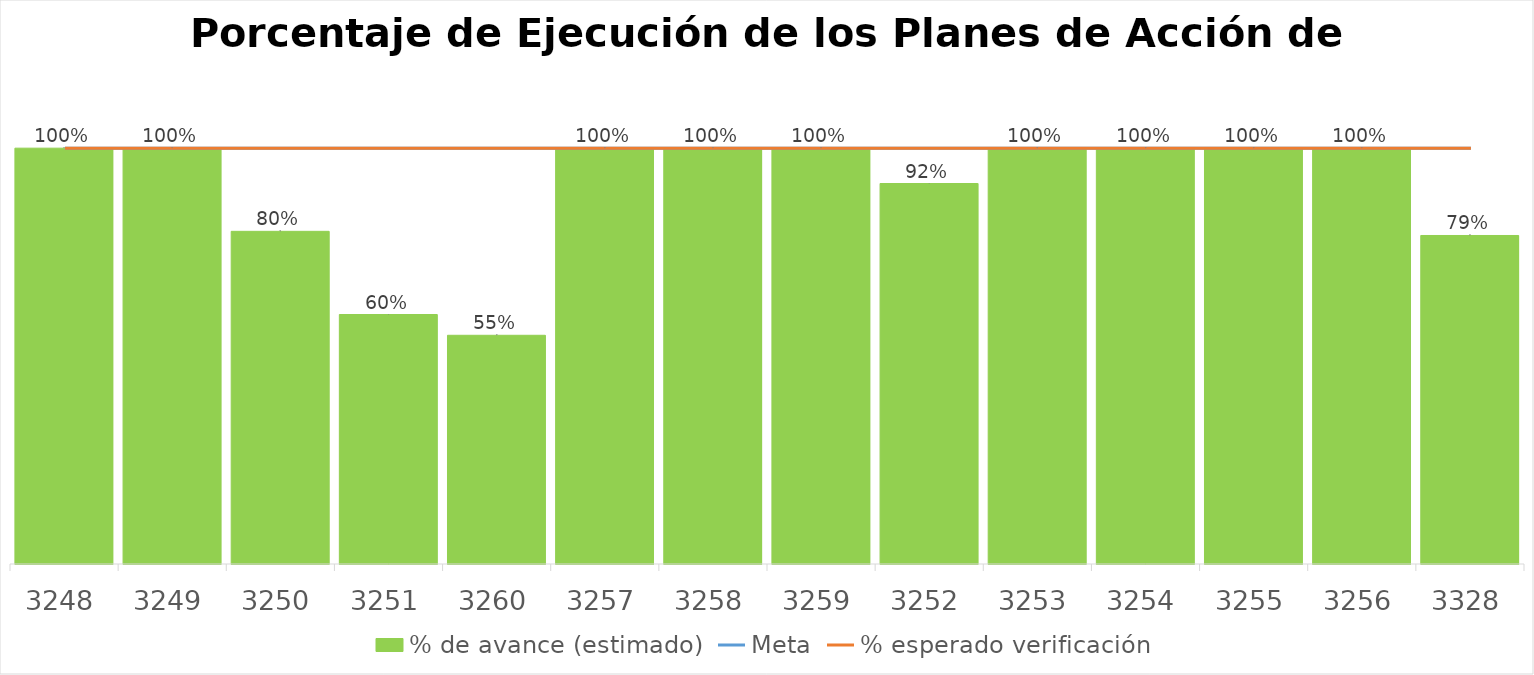
| Category | % de avance (estimado) |
|---|---|
| 3248.0 | 1 |
| 3249.0 | 1 |
| 3250.0 | 0.8 |
| 3251.0 | 0.6 |
| 3260.0 | 0.55 |
| 3257.0 | 1 |
| 3258.0 | 1 |
| 3259.0 | 1 |
| 3252.0 | 0.915 |
| 3253.0 | 1 |
| 3254.0 | 1 |
| 3255.0 | 1 |
| 3256.0 | 1 |
| 3328.0 | 0.79 |